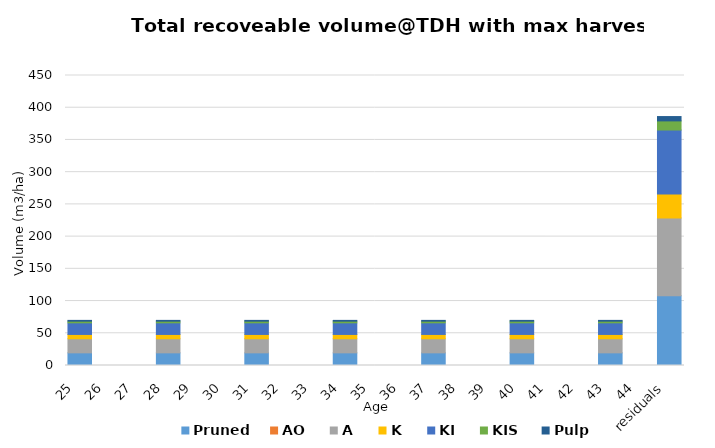
| Category | Pruned | AO | A | K | KI | KIS | Pulp |
|---|---|---|---|---|---|---|---|
|  25  | 19.628 | 0 | 21.848 | 6.727 | 18.01 | 2.565 | 1.221 |
|  26  | 0 | 0 | 0 | 0 | 0 | 0 | 0 |
|  27  | 0 | 0 | 0 | 0 | 0 | 0 | 0 |
|  28  | 19.628 | 0 | 21.848 | 6.727 | 18.01 | 2.565 | 1.221 |
|  29  | 0 | 0 | 0 | 0 | 0 | 0 | 0 |
|  30  | 0 | 0 | 0 | 0 | 0 | 0 | 0 |
|  31  | 19.628 | 0 | 21.848 | 6.727 | 18.01 | 2.565 | 1.221 |
|  32  | 0 | 0 | 0 | 0 | 0 | 0 | 0 |
|  33  | 0 | 0 | 0 | 0 | 0 | 0 | 0 |
|  34  | 19.628 | 0 | 21.848 | 6.727 | 18.01 | 2.565 | 1.221 |
|  35  | 0 | 0 | 0 | 0 | 0 | 0 | 0 |
|  36  | 0 | 0 | 0 | 0 | 0 | 0 | 0 |
|  37  | 19.628 | 0 | 21.848 | 6.727 | 18.01 | 2.565 | 1.221 |
|  38  | 0 | 0 | 0 | 0 | 0 | 0 | 0 |
|  39  | 0 | 0 | 0 | 0 | 0 | 0 | 0 |
|  40  | 19.628 | 0 | 21.848 | 6.727 | 18.01 | 2.565 | 1.221 |
|  41  | 0 | 0 | 0 | 0 | 0 | 0 | 0 |
|  42  | 0 | 0 | 0 | 0 | 0 | 0 | 0 |
|  43  | 19.628 | 0 | 21.848 | 6.727 | 18.01 | 2.565 | 1.221 |
|  44  | 0 | 0 | 0 | 0 | 0 | 0 | 0 |
| residuals | 108.316 | 0 | 120.57 | 37.123 | 99.391 | 14.157 | 6.74 |